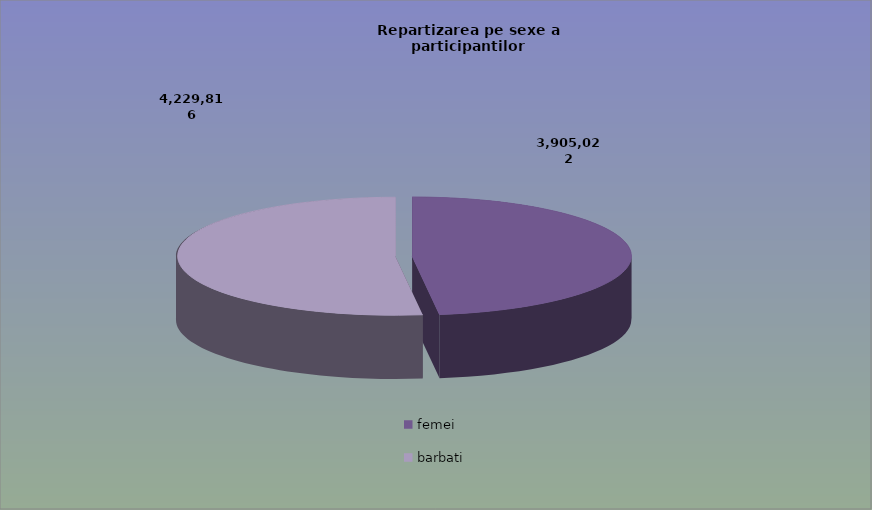
| Category | Series 0 |
|---|---|
| femei | 3905022 |
| barbati | 4229816 |